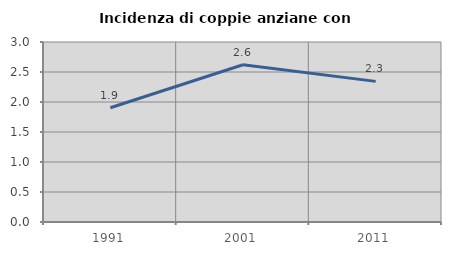
| Category | Incidenza di coppie anziane con figli |
|---|---|
| 1991.0 | 1.905 |
| 2001.0 | 2.62 |
| 2011.0 | 2.344 |